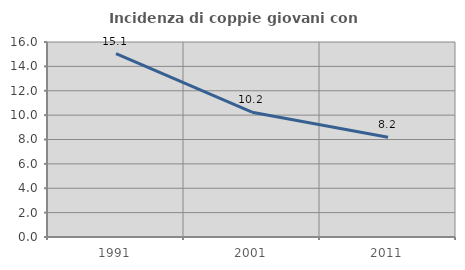
| Category | Incidenza di coppie giovani con figli |
|---|---|
| 1991.0 | 15.052 |
| 2001.0 | 10.241 |
| 2011.0 | 8.182 |